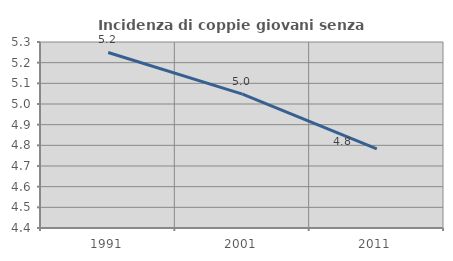
| Category | Incidenza di coppie giovani senza figli |
|---|---|
| 1991.0 | 5.249 |
| 2001.0 | 5.048 |
| 2011.0 | 4.783 |